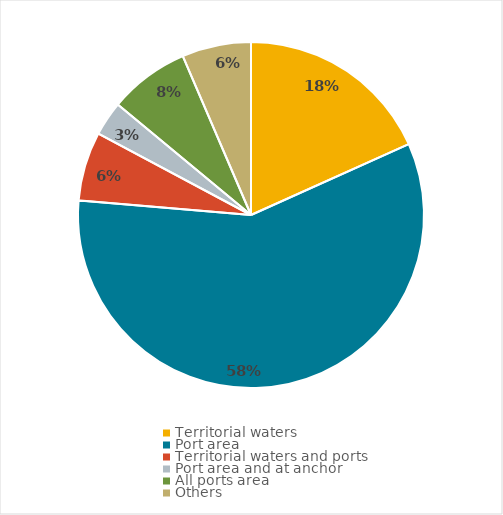
| Category | Series 0 |
|---|---|
| Territorial waters | 0.183 |
| Port area | 0.581 |
| Territorial waters and ports | 0.065 |
| Port area and at anchor | 0.032 |
| All ports area | 0.075 |
| Others | 0.065 |